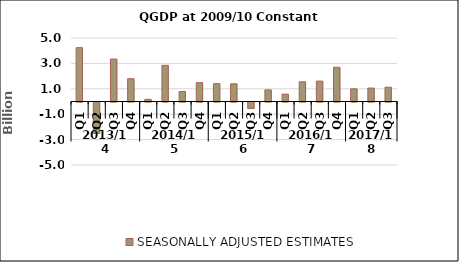
| Category | SEASONALLY ADJUSTED ESTIMATES |
|---|---|
| 0 | 4.24 |
| 1 | -2.464 |
| 2 | 3.342 |
| 3 | 1.794 |
| 4 | 0.17 |
| 5 | 2.848 |
| 6 | 0.785 |
| 7 | 1.485 |
| 8 | 1.404 |
| 9 | 1.394 |
| 10 | -0.504 |
| 11 | 0.914 |
| 12 | 0.578 |
| 13 | 1.551 |
| 14 | 1.607 |
| 15 | 2.693 |
| 16 | 0.998 |
| 17 | 1.059 |
| 18 | 1.125 |